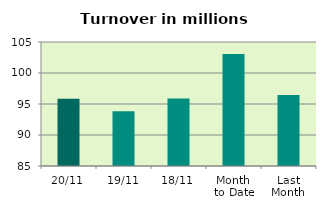
| Category | Series 0 |
|---|---|
| 20/11 | 95.839 |
| 19/11 | 93.848 |
| 18/11 | 95.906 |
| Month 
to Date | 103.081 |
| Last
Month | 96.433 |